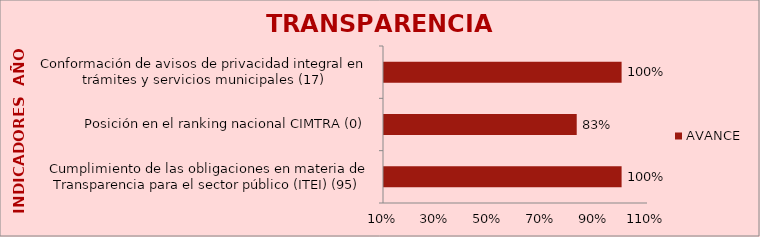
| Category | AVANCE |
|---|---|
| Cumplimiento de las obligaciones en materia de Transparencia para el sector público (ITEI) (95) | 1 |
| Posición en el ranking nacional CIMTRA (0) | 0.83 |
| Conformación de avisos de privacidad integral en trámites y servicios municipales (17) | 1 |